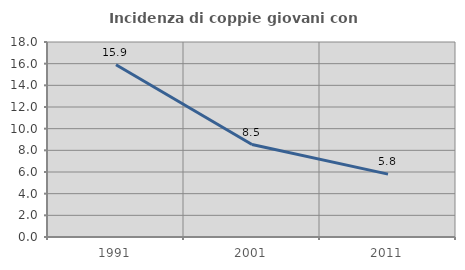
| Category | Incidenza di coppie giovani con figli |
|---|---|
| 1991.0 | 15.894 |
| 2001.0 | 8.535 |
| 2011.0 | 5.806 |